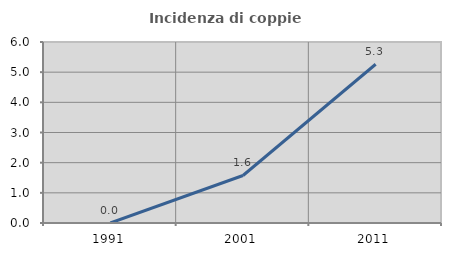
| Category | Incidenza di coppie miste |
|---|---|
| 1991.0 | 0 |
| 2001.0 | 1.575 |
| 2011.0 | 5.263 |